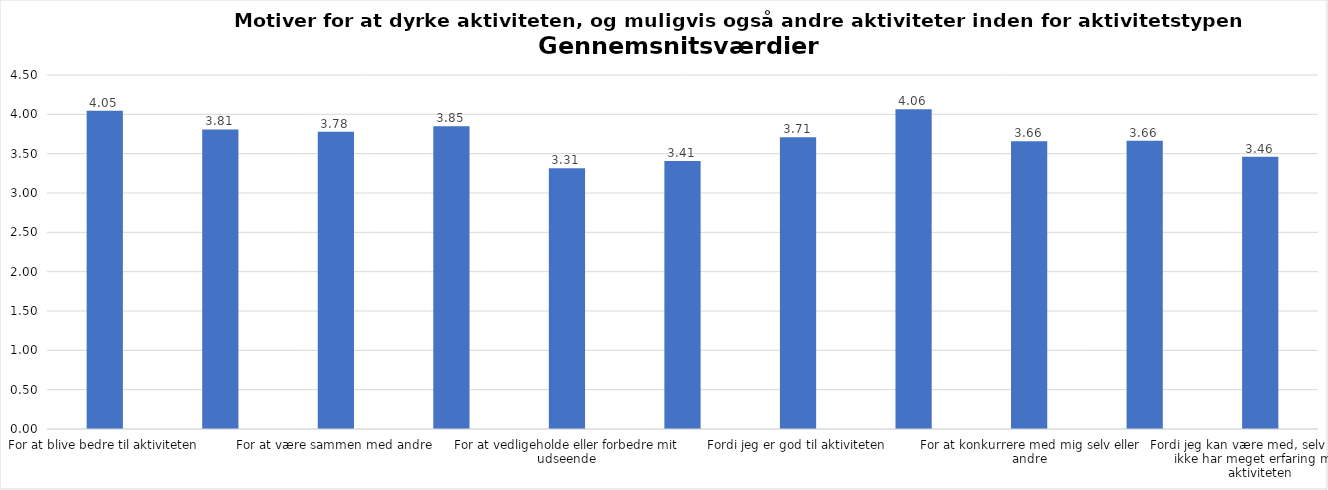
| Category | Gennemsnit |
|---|---|
| For at blive bedre til aktiviteten | 4.047 |
| For at vedligeholde eller forbedre min sundhed (fx helbred, fysisk form) | 3.808 |
| For at være sammen med andre | 3.779 |
| For at gøre noget godt for mig selv | 3.849 |
| For at vedligeholde eller forbedre mit udseende | 3.314 |
| Fordi andre i min omgangskreds opmuntrer mig til det | 3.407 |
| Fordi jeg er god til aktiviteten | 3.709 |
| Fordi jeg godt kan lide aktiviteten | 4.064 |
| For at konkurrere med mig selv eller andre | 3.657 |
| Fordi aktiviteten passer godt ind i min hverdag | 3.663 |
| Fordi jeg kan være med, selv om jeg ikke har meget erfaring med aktiviteten | 3.459 |